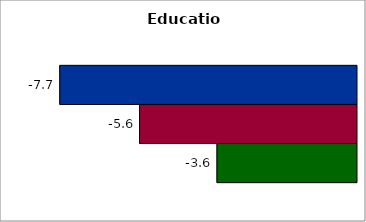
| Category | 50 states and D.C. | SREB states | State |
|---|---|---|---|
| 0 | -7.718 | -5.642 | -3.629 |